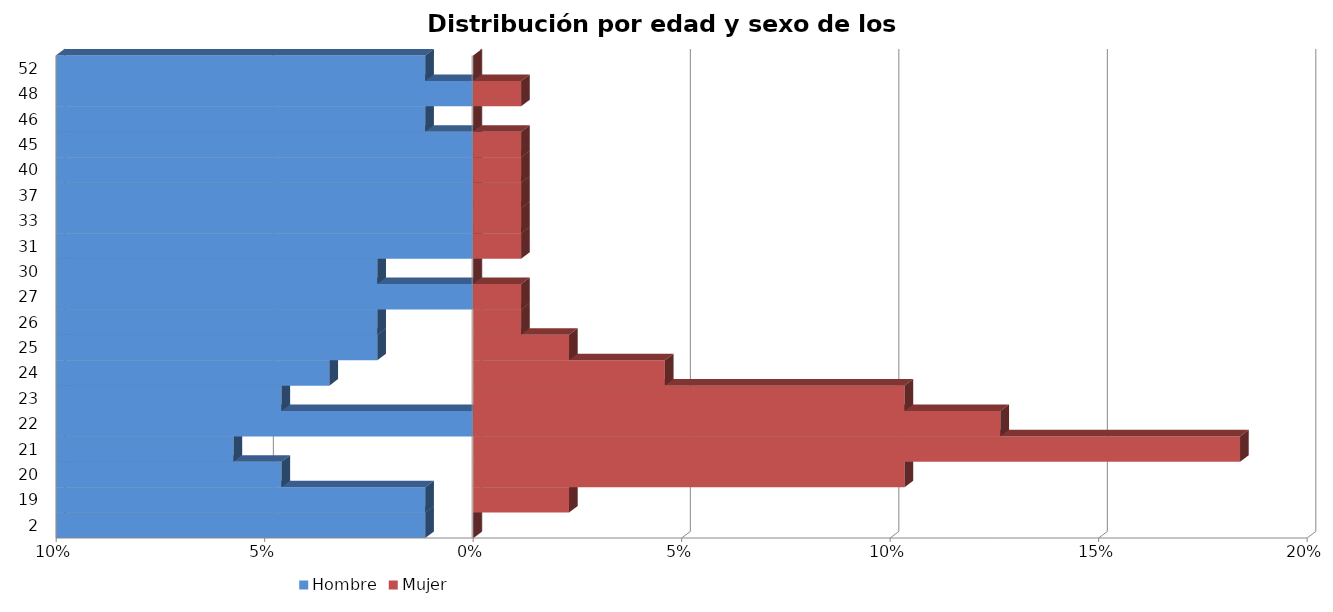
| Category | Hombre | Mujer |
|---|---|---|
| 2.0 | -0.011 | 0 |
| 19.0 | -0.011 | 0.023 |
| 20.0 | -0.046 | 0.103 |
| 21.0 | -0.057 | 0.184 |
| 22.0 | 0 | 0.126 |
| 23.0 | -0.046 | 0.103 |
| 24.0 | -0.034 | 0.046 |
| 25.0 | -0.023 | 0.023 |
| 26.0 | -0.023 | 0.011 |
| 27.0 | 0 | 0.011 |
| 30.0 | -0.023 | 0 |
| 31.0 | 0 | 0.011 |
| 33.0 | 0 | 0.011 |
| 37.0 | 0 | 0.011 |
| 40.0 | 0 | 0.011 |
| 45.0 | 0 | 0.011 |
| 46.0 | -0.011 | 0 |
| 48.0 | 0 | 0.011 |
| 52.0 | -0.011 | 0 |